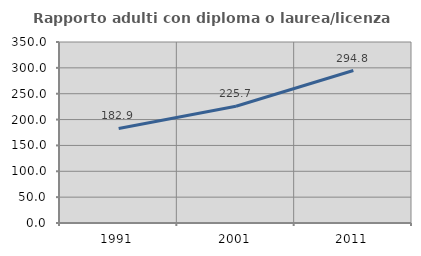
| Category | Rapporto adulti con diploma o laurea/licenza media  |
|---|---|
| 1991.0 | 182.911 |
| 2001.0 | 225.705 |
| 2011.0 | 294.825 |